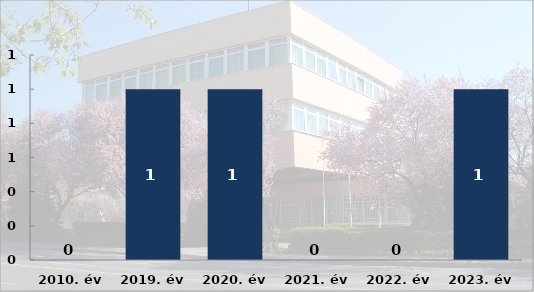
| Category | Meghalt személyek száma (fő) |
|---|---|
| 2010. év | 0 |
| 2019. év | 1 |
| 2020. év | 1 |
| 2021. év | 0 |
| 2022. év | 0 |
| 2023. év | 1 |